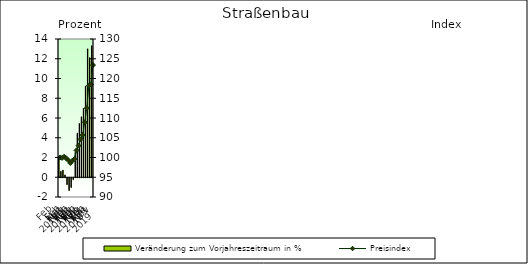
| Category | Veränderung zum Vorjahreszeitraum in % |
|---|---|
| 0 | 1.878 |
| 1 | 0.607 |
| 2 | 0.731 |
| 3 | 0.24 |
| 4 | -0.7 |
| 5 | -1.301 |
| 6 | -0.998 |
| 7 | -0.2 |
| 8 | 2.518 |
| 9 | 4.462 |
| 10 | 5.444 |
| 11 | 6.124 |
| 12 | 6.974 |
| 13 | 9.223 |
| 14 | 13.002 |
| 15 | 12.11 |
| 16 | 13.315 |